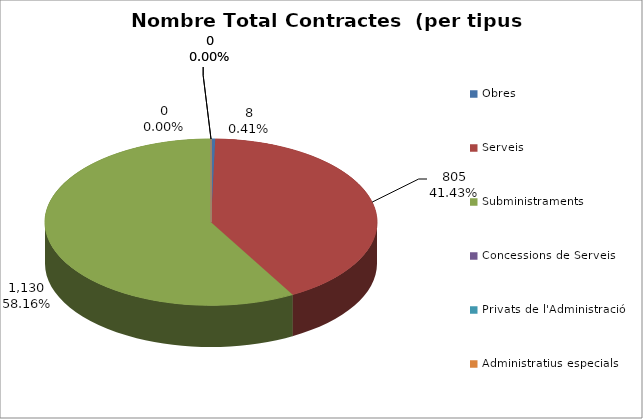
| Category | Nombre Total Contractes |
|---|---|
| Obres | 8 |
| Serveis | 805 |
| Subministraments | 1130 |
| Concessions de Serveis | 0 |
| Privats de l'Administració | 0 |
| Administratius especials | 0 |